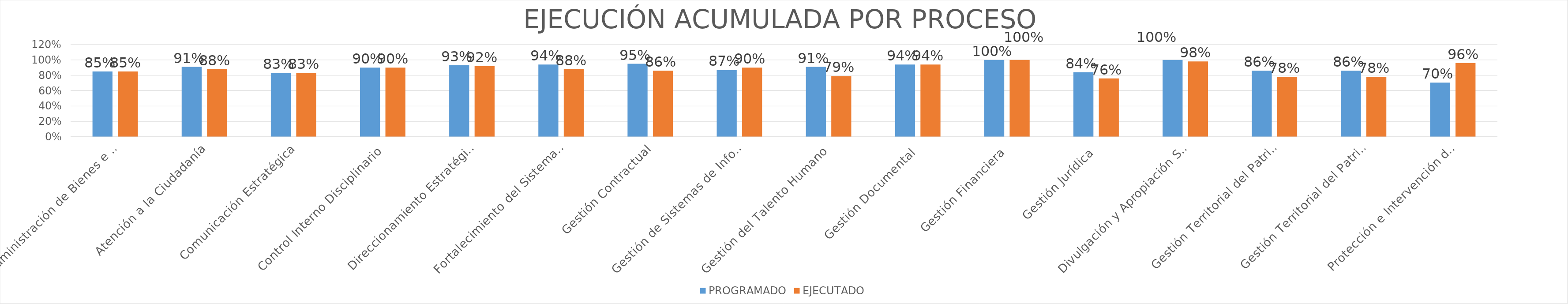
| Category | PROGRAMADO | EJECUTADO |
|---|---|---|
| Administración de Bienes e Infraestructura | 0.85 | 0.85 |
| Atención a la Ciudadanía | 0.91 | 0.88 |
| Comunicación Estratégica | 0.83 | 0.83 |
| Control Interno Disciplinario | 0.9 | 0.9 |
| Direccionamiento Estratégico | 0.93 | 0.92 |
| Fortalecimiento del Sistema Integrado de Gestión | 0.94 | 0.88 |
| Gestión Contractual | 0.95 | 0.86 |
| Gestión de Sistemas de Información y Tecnología | 0.87 | 0.9 |
| Gestión del Talento Humano | 0.91 | 0.79 |
| Gestión Documental | 0.94 | 0.94 |
| Gestión Financiera | 1 | 1 |
| Gestión Jurídica | 0.84 | 0.76 |
| Divulgación y Apropiación Social del Patrimonio | 1 | 0.98 |
| Gestión Territorial del Patrimonio | 0.86 | 0.78 |
| Gestión Territorial del Patrimonio | 0.86 | 0.78 |
| Protección e Intervención del Patrimonio | 0.705 | 0.961 |